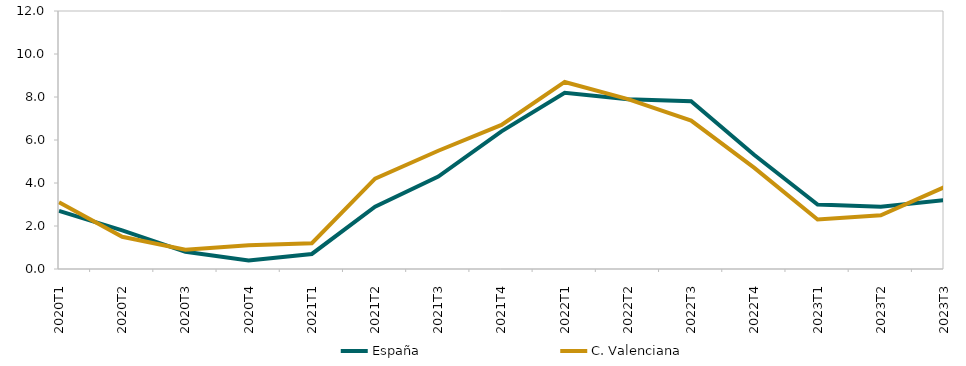
| Category | España | C. Valenciana |
|---|---|---|
| 2020T1 | 2.7 | 3.1 |
| 2020T2 | 1.8 | 1.5 |
| 2020T3 | 0.8 | 0.9 |
| 2020T4 | 0.4 | 1.1 |
| 2021T1 | 0.7 | 1.2 |
| 2021T2 | 2.9 | 4.2 |
| 2021T3 | 4.3 | 5.5 |
| 2021T4 | 6.4 | 6.7 |
| 2022T1 | 8.2 | 8.7 |
| 2022T2 | 7.9 | 7.9 |
| 2022T3 | 7.8 | 6.9 |
| 2022T4 | 5.3 | 4.7 |
| 2023T1 | 3 | 2.3 |
| 2023T2 | 2.9 | 2.5 |
| 2023T3 | 3.2 | 3.8 |